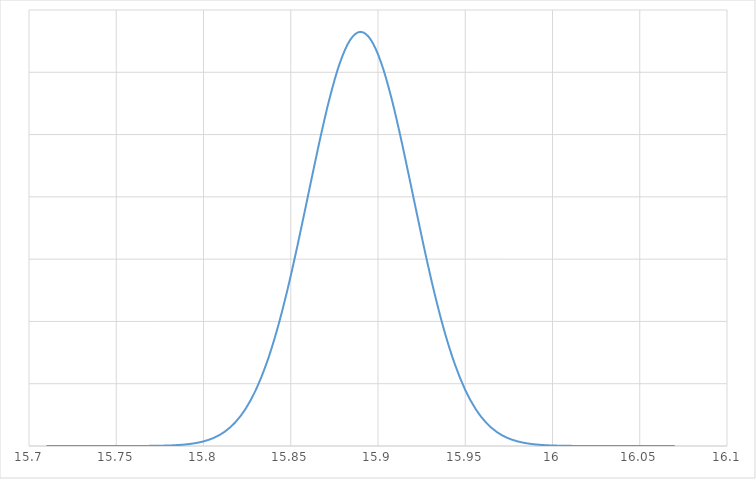
| Category | Series 0 |
|---|---|
| 15.71 | 0 |
| 15.716000000000001 | 0 |
| 15.722000000000001 | 0 |
| 15.728 | 0 |
| 15.734 | 0 |
| 15.74 | 0 |
| 15.746 | 0 |
| 15.752 | 0 |
| 15.758000000000001 | 0.001 |
| 15.764000000000001 | 0.002 |
| 15.770000000000001 | 0.004 |
| 15.776 | 0.01 |
| 15.782 | 0.02 |
| 15.788 | 0.041 |
| 15.794 | 0.079 |
| 15.8 | 0.148 |
| 15.806000000000001 | 0.264 |
| 15.812000000000001 | 0.453 |
| 15.818000000000001 | 0.746 |
| 15.824 | 1.182 |
| 15.83 | 1.8 |
| 15.836 | 2.632 |
| 15.842 | 3.697 |
| 15.848 | 4.991 |
| 15.854000000000001 | 6.473 |
| 15.860000000000001 | 8.066 |
| 15.866000000000001 | 9.656 |
| 15.872 | 11.107 |
| 15.878 | 12.276 |
| 15.884 | 13.035 |
| 15.89 | 13.298 |
| 15.896 | 13.035 |
| 15.902000000000001 | 12.276 |
| 15.908000000000001 | 11.107 |
| 15.914000000000001 | 9.656 |
| 15.92 | 8.066 |
| 15.926 | 6.473 |
| 15.932 | 4.991 |
| 15.938 | 3.697 |
| 15.944 | 2.632 |
| 15.950000000000001 | 1.8 |
| 15.956000000000001 | 1.182 |
| 15.962 | 0.746 |
| 15.968 | 0.453 |
| 15.974 | 0.264 |
| 15.98 | 0.148 |
| 15.986 | 0.079 |
| 15.992 | 0.041 |
| 15.998000000000001 | 0.02 |
| 16.004 | 0.01 |
| 16.01 | 0.004 |
| 16.016000000000002 | 0.002 |
| 16.022000000000002 | 0.001 |
| 16.028000000000002 | 0 |
| 16.034 | 0 |
| 16.04 | 0 |
| 16.046 | 0 |
| 16.052 | 0 |
| 16.058 | 0 |
| 16.064 | 0 |
| 16.07 | 0 |